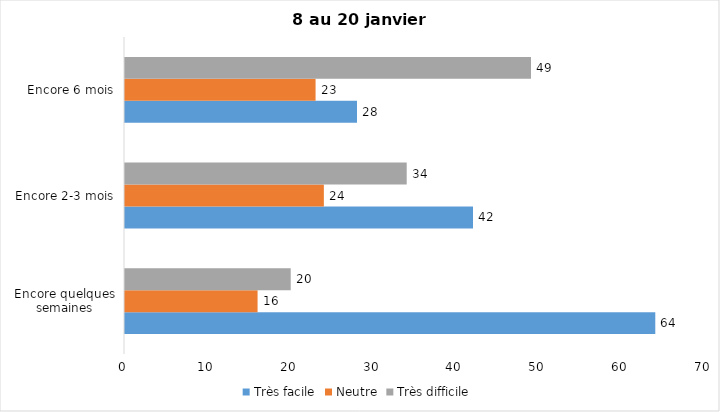
| Category | Très facile | Neutre | Très difficile |
|---|---|---|---|
| Encore quelques semaines | 64 | 16 | 20 |
| Encore 2-3 mois | 42 | 24 | 34 |
| Encore 6 mois | 28 | 23 | 49 |